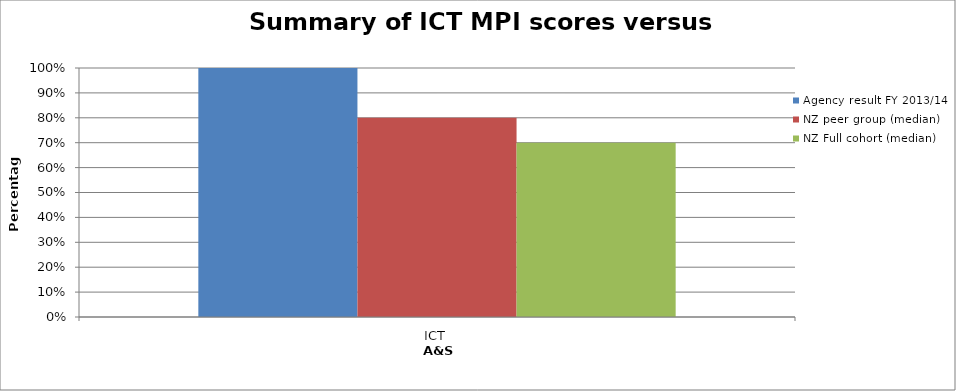
| Category | Agency result FY 2013/14  | NZ peer group (median) | NZ Full cohort (median) |
|---|---|---|---|
| ICT | 1 | 0.8 | 0.7 |